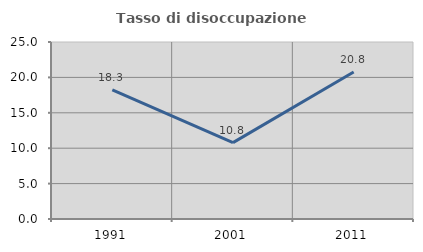
| Category | Tasso di disoccupazione giovanile  |
|---|---|
| 1991.0 | 18.254 |
| 2001.0 | 10.784 |
| 2011.0 | 20.755 |